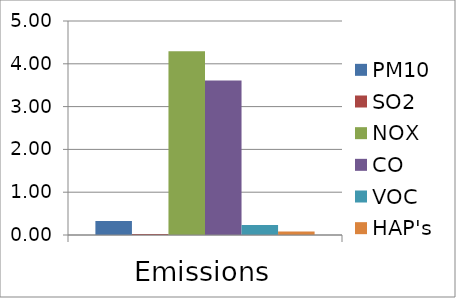
| Category | PM10 | SO2 | NOX | CO | VOC | HAP's |
|---|---|---|---|---|---|---|
| Emissions | 0.326 | 0.026 | 4.294 | 3.607 | 0.236 | 0.081 |